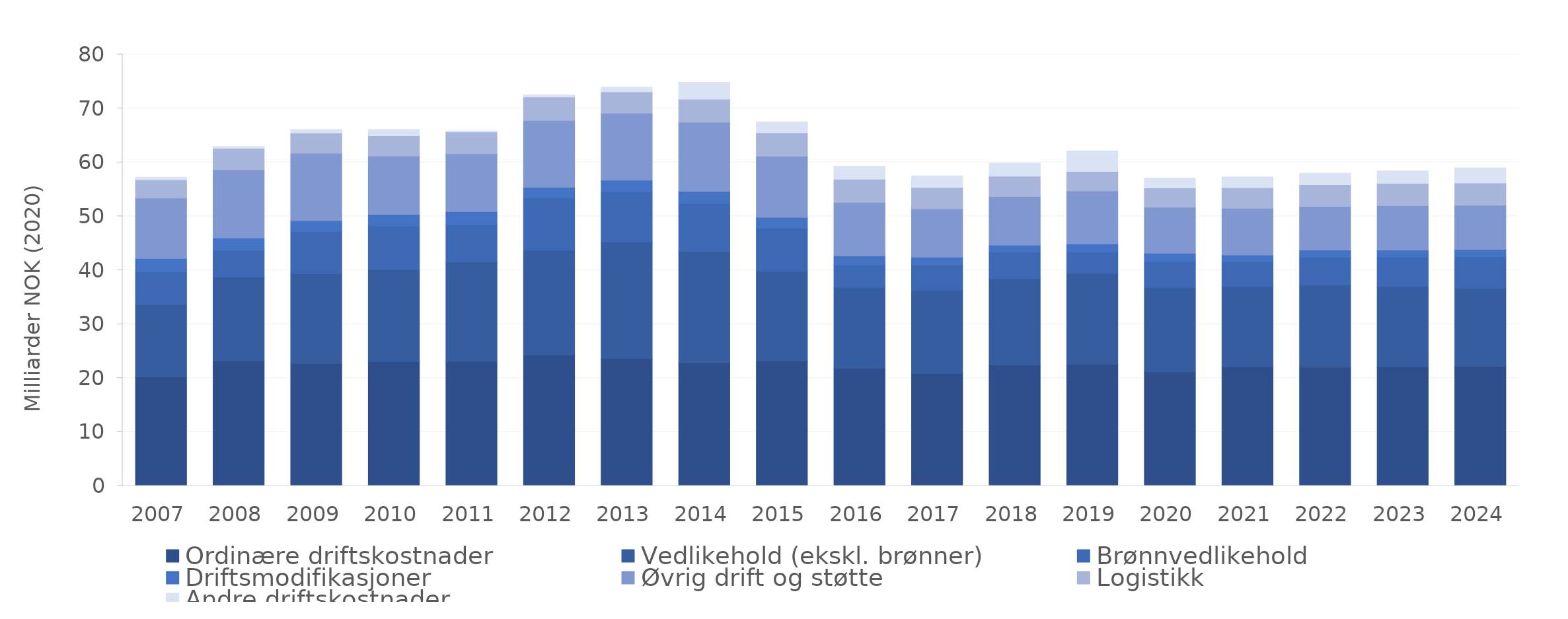
| Category | Ordinære driftskostnader | Vedlikehold (ekskl. brønner) | Brønnvedlikehold | Driftsmodifikasjoner | Øvrig drift og støtte | Logistikk | Andre driftskostnader |
|---|---|---|---|---|---|---|---|
| 2007.0 | 20.202 | 13.469 | 6.036 | 2.457 | 11.208 | 3.378 | 0.499 |
| 2008.0 | 23.184 | 15.521 | 4.989 | 2.289 | 12.658 | 3.95 | 0.336 |
| 2009.0 | 22.704 | 16.624 | 7.851 | 2.02 | 12.476 | 3.792 | 0.627 |
| 2010.0 | 23.048 | 17.079 | 8.06 | 2.176 | 10.835 | 3.746 | 1.156 |
| 2011.0 | 23.085 | 18.452 | 6.9 | 2.436 | 10.706 | 4.046 | 0.203 |
| 2012.0 | 24.26 | 19.434 | 9.68 | 2.017 | 12.378 | 4.349 | 0.393 |
| 2013.0 | 23.599 | 21.629 | 9.289 | 2.182 | 12.424 | 3.966 | 0.842 |
| 2014.0 | 22.845 | 20.604 | 8.891 | 2.281 | 12.812 | 4.297 | 3.138 |
| 2015.0 | 23.175 | 16.614 | 8.025 | 2 | 11.305 | 4.35 | 2.037 |
| 2016.0 | 21.822 | 14.913 | 4.315 | 1.616 | 9.923 | 4.274 | 2.395 |
| 2017.0 | 20.864 | 15.427 | 4.681 | 1.451 | 8.977 | 3.931 | 2.158 |
| 2018.0 | 22.427 | 15.954 | 4.913 | 1.348 | 9.005 | 3.771 | 2.433 |
| 2019.0 | 22.572 | 16.825 | 3.964 | 1.537 | 9.814 | 3.601 | 3.807 |
| 2020.0 | 21.164 | 15.571 | 4.832 | 1.601 | 8.493 | 3.587 | 1.843 |
| 2021.0 | 22.086 | 14.898 | 4.596 | 1.242 | 8.668 | 3.825 | 1.989 |
| 2022.0 | 21.978 | 15.249 | 5.148 | 1.352 | 8.108 | 4.015 | 2.128 |
| 2023.0 | 22.081 | 14.915 | 5.414 | 1.326 | 8.234 | 4.147 | 2.284 |
| 2024.0 | 22.175 | 14.487 | 5.864 | 1.329 | 8.192 | 4.139 | 2.784 |